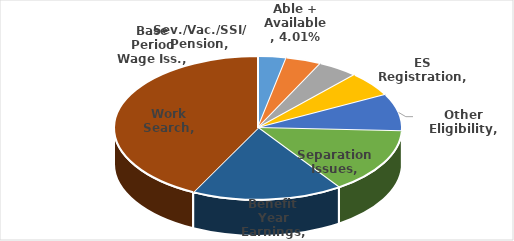
| Category | Series 0 |
|---|---|
| Sev./Vac./SSI/ Pension | 0.032 |
| Able + Available | 0.04 |
| Base Period Wage Iss. | 0.046 |
| ES Registration | 0.056 |
| Other Eligibility | 0.084 |
| Separation Issues | 0.148 |
| Benefit Year Earnings | 0.169 |
| Work Search | 0.426 |